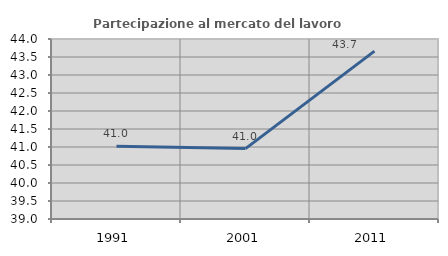
| Category | Partecipazione al mercato del lavoro  femminile |
|---|---|
| 1991.0 | 41.024 |
| 2001.0 | 40.956 |
| 2011.0 | 43.664 |